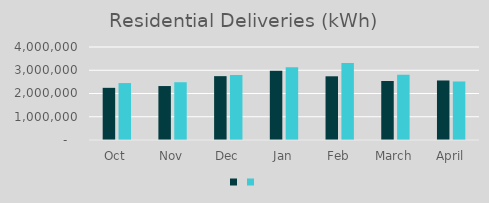
| Category | Series 1 | Series 0 |
|---|---|---|
| Oct | 2243531 | 2448610 |
| Nov | 2320465 | 2484917 |
| Dec | 2746090 | 2793607 |
| Jan | 2975165 | 3124442 |
| Feb | 2739688 | 3307618 |
| March | 2538769 | 2805250 |
| April | 2560197 | 2517652 |